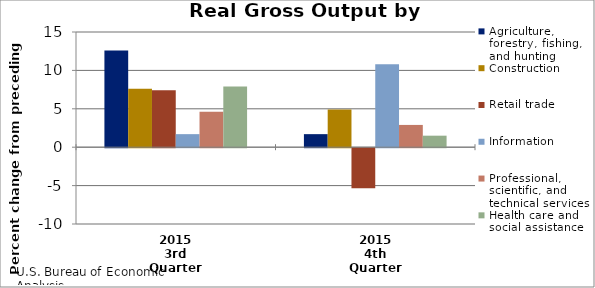
| Category | Agriculture, forestry, fishing, and hunting | Construction | Retail trade | Information | Professional, scientific, and technical services | Health care and social assistance |
|---|---|---|---|---|---|---|
| 2015
3rd Quarter | 12.6 | 7.6 | 7.4 | 1.7 | 4.6 | 7.9 |
| 2015
4th Quarter | 1.7 | 4.9 | -5.2 | 10.8 | 2.9 | 1.5 |